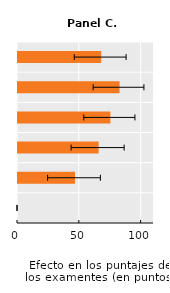
| Category | Series 0 |
|---|---|
| Nunca | 0 |
| 13 años o más | 46.1 |
| 10-12 | 65.216 |
| 7-9 | 74.694 |
| 4-6 | 82.138 |
| 3 años o menos | 67.302 |